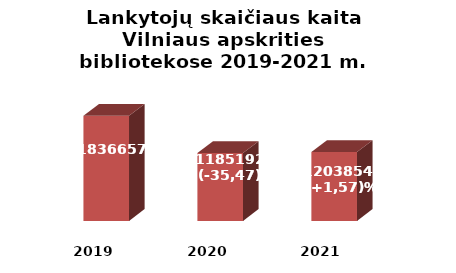
| Category | Series 0 |
|---|---|
| 2019.0 | 1836657 |
| 2020.0 | 1185192 |
| 2021.0 | 1203854 |